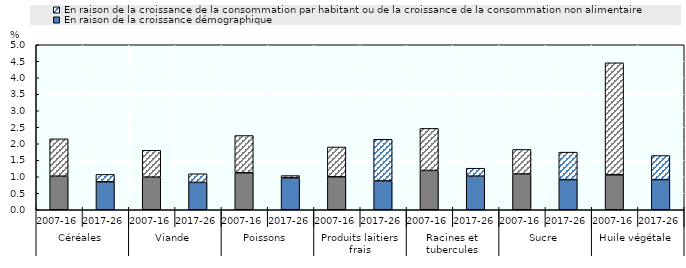
| Category | En raison de la croissance démographique | En raison de la croissance de la consommation par habitant ou de la croissance de la consommation non alimentaire |
|---|---|---|
| 0 | 1.017 | 1.131 |
| 1 | 0.847 | 0.225 |
| 2 | 0.988 | 0.815 |
| 3 | 0.829 | 0.262 |
| 4 | 1.122 | 1.127 |
| 5 | 0.966 | 0.069 |
| 6 | 0.998 | 0.904 |
| 7 | 0.873 | 1.263 |
| 8 | 1.192 | 1.273 |
| 9 | 1.018 | 0.24 |
| 10 | 1.083 | 0.744 |
| 11 | 0.914 | 0.832 |
| 12 | 1.059 | 3.394 |
| 13 | 0.914 | 0.729 |